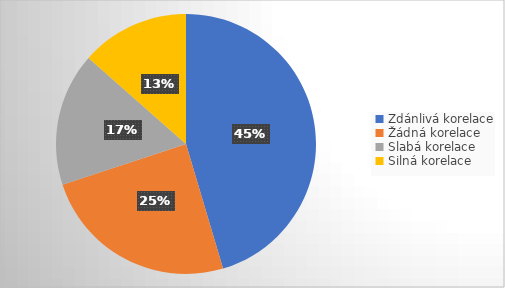
| Category | Series 0 |
|---|---|
| Zdánlivá korelace | 74 |
| Žádná korelace | 40 |
| Slabá korelace | 27 |
| Silná korelace | 22 |